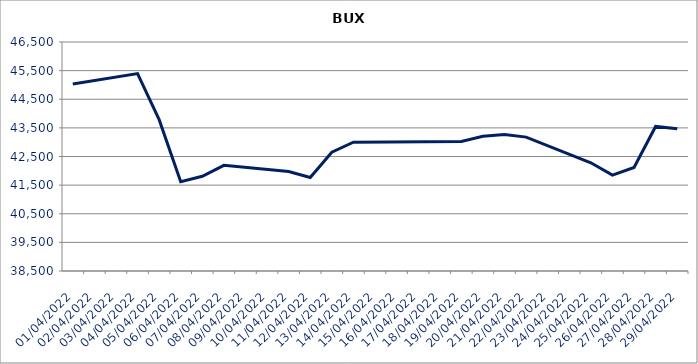
| Category | Series 0 |
|---|---|
| 01/04/2022 | 45034.79 |
| 04/04/2022 | 45397.52 |
| 05/04/2022 | 43787 |
| 06/04/2022 | 41616.26 |
| 07/04/2022 | 41807.97 |
| 08/04/2022 | 42191.13 |
| 11/04/2022 | 41972.84 |
| 12/04/2022 | 41766.96 |
| 13/04/2022 | 42651.63 |
| 14/04/2022 | 42999.39 |
| 19/04/2022 | 43026.8 |
| 20/04/2022 | 43208.44 |
| 21/04/2022 | 43265.66 |
| 22/04/2022 | 43176.64 |
| 25/04/2022 | 42280.37 |
| 26/04/2022 | 41848.66 |
| 27/04/2022 | 42116.04 |
| 28/04/2022 | 43549.19 |
| 29/04/2022 | 43469.84 |